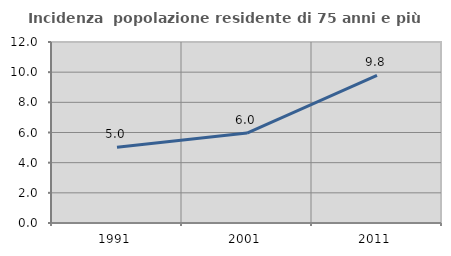
| Category | Incidenza  popolazione residente di 75 anni e più |
|---|---|
| 1991.0 | 5.021 |
| 2001.0 | 5.961 |
| 2011.0 | 9.785 |